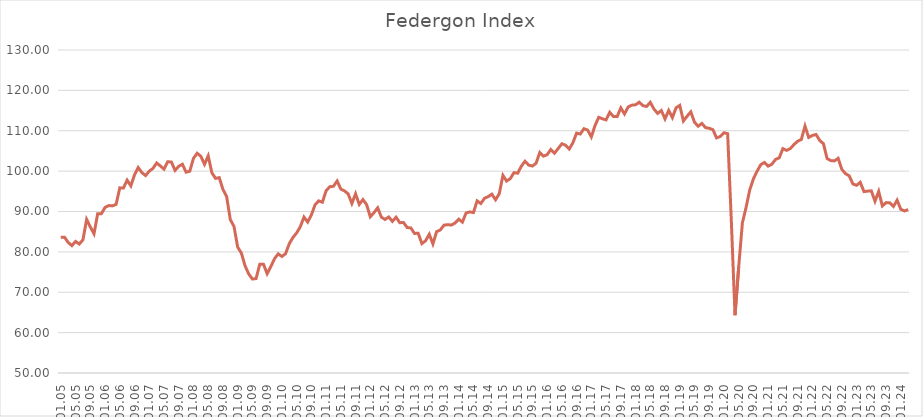
| Category | Series 0 |
|---|---|
| 01.05 | 83.634 |
| 02.05 | 83.639 |
| 03.05 | 82.322 |
| 04.05 | 81.542 |
| 05.05 | 82.594 |
| 06.05 | 81.945 |
| 07.05 | 82.988 |
| 08.05 | 88.034 |
| 09.05 | 86.185 |
| 10.05 | 84.473 |
| 11.05 | 89.468 |
| 12.05 | 89.455 |
| 01.06 | 91.008 |
| 02.06 | 91.473 |
| 03.06 | 91.388 |
| 04.06 | 91.762 |
| 05.06 | 95.852 |
| 06.06 | 95.839 |
| 07.06 | 97.774 |
| 08.06 | 96.346 |
| 09.06 | 99.059 |
| 10.06 | 100.883 |
| 11.06 | 99.644 |
| 12.06 | 98.901 |
| 01.07 | 100 |
| 02.07 | 100.669 |
| 03.07 | 102.015 |
| 04.07 | 101.299 |
| 05.07 | 100.488 |
| 06.07 | 102.3 |
| 07.07 | 102.284 |
| 08.07 | 100.176 |
| 09.07 | 101.198 |
| 10.07 | 101.716 |
| 11.07 | 99.73 |
| 12.07 | 99.983 |
| 01.08 | 103.163 |
| 02.08 | 104.423 |
| 03.08 | 103.686 |
| 04.08 | 101.683 |
| 05.08 | 103.779 |
| 06.08 | 99.581 |
| 07.08 | 98.212 |
| 08.08 | 98.381 |
| 09.08 | 95.47 |
| 10.08 | 93.726 |
| 11.08 | 87.985 |
| 12.08 | 86.312 |
| 01.09 | 81.176 |
| 02.09 | 79.711 |
| 03.09 | 76.556 |
| 04.09 | 74.524 |
| 05.09 | 73.272 |
| 06.09 | 73.4 |
| 07.09 | 76.943 |
| 08.09 | 76.958 |
| 09.09 | 74.586 |
| 10.09 | 76.356 |
| 11.09 | 78.307 |
| 12.09 | 79.504 |
| 01.10 | 78.859 |
| 02.10 | 79.552 |
| 03.10 | 82.005 |
| 04.10 | 83.572 |
| 05.10 | 84.682 |
| 06.10 | 86.227 |
| 07.10 | 88.629 |
| 08.10 | 87.4 |
| 09.10 | 89.119 |
| 10.10 | 91.642 |
| 11.10 | 92.631 |
| 12.10 | 92.301 |
| 01.11 | 95.138 |
| 02.11 | 96.136 |
| 03.11 | 96.248 |
| 04.11 | 97.552 |
| 05.11 | 95.554 |
| 06.11 | 95.107 |
| 07.11 | 94.347 |
| 08.11 | 91.99 |
| 09.11 | 94.388 |
| 10.11 | 91.754 |
| 11.11 | 92.944 |
| 12.11 | 91.702 |
| 01.12 | 88.691 |
| 02.12 | 89.705 |
| 03.12 | 90.911 |
| 04.12 | 88.604 |
| 05.12 | 88.03 |
| 06.12 | 88.647 |
| 07.12 | 87.556 |
| 08.12 | 88.589 |
| 09.12 | 87.213 |
| 10.12 | 87.288 |
| 11.12 | 86.041 |
| 12.12 | 85.926 |
| 01.13 | 84.565 |
| 02.13 | 84.609 |
| 03.13 | 82.046 |
| 04.13 | 82.736 |
| 05.13 | 84.366 |
| 06.13 | 81.972 |
| 07.13 | 85.011 |
| 08.13 | 85.415 |
| 09.13 | 86.61 |
| 10.13 | 86.736 |
| 11.13 | 86.645 |
| 12.13 | 87.14 |
| 01.14 | 88.1 |
| 02.14 | 87.369 |
| 03.14 | 89.637 |
| 04.14 | 89.892 |
| 05.14 | 89.739 |
| 06.14 | 92.634 |
| 07.14 | 91.981 |
| 08.14 | 93.28 |
| 09.14 | 93.683 |
| 10.14 | 94.294 |
| 11.14 | 92.904 |
| 12.14 | 94.397 |
| 01.15 | 98.948 |
| 02.15 | 97.546 |
| 03.15 | 98.141 |
| 04.15 | 99.62 |
| 05.15 | 99.48 |
| 06.15 | 101.221 |
| 07.15 | 102.449 |
| 08.15 | 101.486 |
| 09.15 | 101.257 |
| 10.15 | 101.953 |
| 11.15 | 104.595 |
| 12.15 | 103.704 |
| 01.16 | 104.069 |
| 02.16 | 105.363 |
| 03.16 | 104.443 |
| 04.16 | 105.597 |
| 05.16 | 106.782 |
| 06.16 | 106.42 |
| 07.16 | 105.466 |
| 08.16 | 107.036 |
| 09.16 | 109.412 |
| 10.16 | 109.193 |
| 11.16 | 110.515 |
| 12.16 | 110.172 |
| 01.17 | 108.463 |
| 02.17 | 111.278 |
| 03.17 | 113.329 |
| 04.17 | 112.969 |
| 05.17 | 112.69 |
| 06.17 | 114.556 |
| 07.17 | 113.521 |
| 08.17 | 113.5 |
| 09.17 | 115.66 |
| 10.17 | 114.158 |
| 11.17 | 115.899 |
| 12.17 | 116.339 |
| 01.18 | 116.428 |
| 02.18 | 117.063 |
| 03.18 | 116.213 |
| 04.18 | 116.021 |
| 05.18 | 117.031 |
| 06.18 | 115.378 |
| 07.18 | 114.296 |
| 08.18 | 115.016 |
| 09.18 | 112.938 |
| 10.18 | 115.044 |
| 11.18 | 113.247 |
| 12.18 | 115.69 |
| 01.19 | 116.287 |
| 02.19 | 112.423 |
| 03.19 | 113.606 |
| 04.19 | 114.683 |
| 05.19 | 112.123 |
| 06.19 | 111.114 |
| 07.19 | 111.821 |
| 08.19 | 110.77 |
| 09.19 | 110.613 |
| 10.19 | 110.267 |
| 11.19 | 108.226 |
| 12.19 | 108.587 |
| 01.20 | 109.512 |
| 02.20 | 109.268 |
| 03.20 | 87.704 |
| 04.20 | 64.311 |
| 05.20 | 76.257 |
| 06.20 | 87.176 |
| 07.20 | 91.004 |
| 08.20 | 95.362 |
| 09.20 | 98.119 |
| 10.20 | 99.992 |
| 11.20 | 101.615 |
| 12.20 | 102.146 |
| 01.21 | 101.243 |
| 02.21 | 101.714 |
| 03.21 | 102.89 |
| 04.21 | 103.293 |
| 05.21 | 105.582 |
| 06.21 | 105.13 |
| 07.21 | 105.573 |
| 08.21 | 106.575 |
| 09.21 | 107.412 |
| 10.21 | 107.837 |
| 11.21 | 111.158 |
| 12.21 | 108.339 |
| 01.22 | 108.839 |
| 02.22 | 109.079 |
| 03.22 | 107.586 |
| 04.22 | 106.797 |
| 05.22 | 103.117 |
| 06.22 | 102.611 |
| 07.22 | 102.527 |
| 08.22 | 103.188 |
| 09.22 | 100.416 |
| 10.22 | 99.369 |
| 11.22 | 98.827 |
| 12.22 | 96.823 |
| 01.23 | 96.48 |
| 02.23 | 97.235 |
| 03.23 | 94.928 |
| 04.23 | 95.043 |
| 05.23 | 95.108 |
| 06.23 | 92.537 |
| 07.23 | 94.984 |
| 08.23 | 91.381 |
| 09.23 | 92.206 |
| 10.23 | 92.146 |
| 11.23 | 91.244 |
| 12.23 | 92.802 |
| 01.24 | 90.55 |
| 02.24 | 90.131 |
| 03.24 | 90.486 |